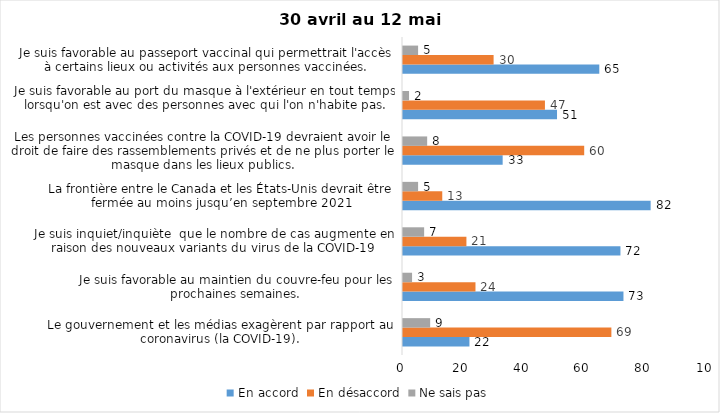
| Category | En accord | En désaccord | Ne sais pas |
|---|---|---|---|
| Le gouvernement et les médias exagèrent par rapport au coronavirus (la COVID-19). | 22 | 69 | 9 |
| Je suis favorable au maintien du couvre-feu pour les prochaines semaines. | 73 | 24 | 3 |
| Je suis inquiet/inquiète  que le nombre de cas augmente en raison des nouveaux variants du virus de la COVID-19 | 72 | 21 | 7 |
| La frontière entre le Canada et les États-Unis devrait être fermée au moins jusqu’en septembre 2021 | 82 | 13 | 5 |
| Les personnes vaccinées contre la COVID-19 devraient avoir le droit de faire des rassemblements privés et de ne plus porter le masque dans les lieux publics. | 33 | 60 | 8 |
| Je suis favorable au port du masque à l'extérieur en tout temps lorsqu'on est avec des personnes avec qui l'on n'habite pas. | 51 | 47 | 2 |
| Je suis favorable au passeport vaccinal qui permettrait l'accès à certains lieux ou activités aux personnes vaccinées. | 65 | 30 | 5 |